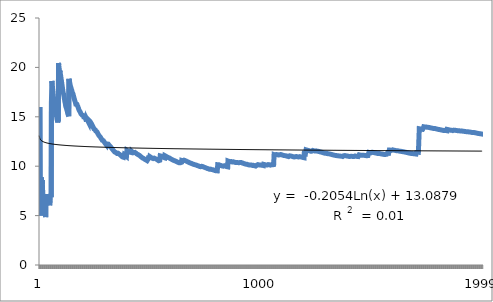
| Category | Series 0 |
|---|---|
| 0 | 16 |
| 1 | 9 |
| 2 | 7.333 |
| 3 | 6 |
| 4 | 5.6 |
| 5 | 5 |
| 6 | 8.857 |
| 7 | 8.25 |
| 8 | 7.778 |
| 9 | 8.6 |
| 10 | 8.182 |
| 11 | 7.667 |
| 12 | 7.385 |
| 13 | 7 |
| 14 | 6.667 |
| 15 | 6.5 |
| 16 | 6.353 |
| 17 | 6.111 |
| 18 | 5.895 |
| 19 | 5.7 |
| 20 | 5.524 |
| 21 | 5.364 |
| 22 | 5.217 |
| 23 | 5.083 |
| 24 | 4.96 |
| 25 | 4.846 |
| 26 | 7.037 |
| 27 | 6.857 |
| 28 | 7.172 |
| 29 | 7 |
| 30 | 6.839 |
| 31 | 6.75 |
| 32 | 6.788 |
| 33 | 6.706 |
| 34 | 6.571 |
| 35 | 6.5 |
| 36 | 6.378 |
| 37 | 6.263 |
| 38 | 6.154 |
| 39 | 6.4 |
| 40 | 6.293 |
| 41 | 6.19 |
| 42 | 6.14 |
| 43 | 6.045 |
| 44 | 6 |
| 45 | 6.565 |
| 46 | 6.596 |
| 47 | 7.125 |
| 48 | 7.02 |
| 49 | 6.96 |
| 50 | 6.863 |
| 51 | 16.577 |
| 52 | 16.566 |
| 53 | 18.63 |
| 54 | 18.436 |
| 55 | 18.179 |
| 56 | 17.895 |
| 57 | 17.724 |
| 58 | 17.492 |
| 59 | 17.233 |
| 60 | 16.984 |
| 61 | 16.742 |
| 62 | 16.508 |
| 63 | 16.281 |
| 64 | 16.062 |
| 65 | 15.939 |
| 66 | 15.821 |
| 67 | 15.706 |
| 68 | 15.536 |
| 69 | 15.371 |
| 70 | 15.606 |
| 71 | 15.5 |
| 72 | 15.342 |
| 73 | 15.162 |
| 74 | 15.067 |
| 75 | 14.921 |
| 76 | 14.753 |
| 77 | 14.667 |
| 78 | 14.582 |
| 79 | 14.425 |
| 80 | 14.642 |
| 81 | 14.659 |
| 82 | 14.53 |
| 83 | 20.452 |
| 84 | 20.235 |
| 85 | 20.023 |
| 86 | 19.885 |
| 87 | 19.705 |
| 88 | 19.528 |
| 89 | 19.667 |
| 90 | 19.473 |
| 91 | 19.435 |
| 92 | 19.269 |
| 93 | 19.106 |
| 94 | 18.947 |
| 95 | 18.771 |
| 96 | 18.66 |
| 97 | 18.49 |
| 98 | 18.343 |
| 99 | 18.18 |
| 100 | 18.02 |
| 101 | 17.863 |
| 102 | 17.709 |
| 103 | 17.558 |
| 104 | 17.429 |
| 105 | 17.415 |
| 106 | 17.29 |
| 107 | 17.148 |
| 108 | 17.028 |
| 109 | 16.891 |
| 110 | 16.757 |
| 111 | 16.625 |
| 112 | 16.496 |
| 113 | 16.386 |
| 114 | 16.261 |
| 115 | 16.138 |
| 116 | 16.017 |
| 117 | 15.949 |
| 118 | 15.95 |
| 119 | 15.85 |
| 120 | 15.736 |
| 121 | 15.672 |
| 122 | 15.61 |
| 123 | 15.5 |
| 124 | 15.392 |
| 125 | 15.333 |
| 126 | 15.228 |
| 127 | 15.234 |
| 128 | 15.132 |
| 129 | 15.046 |
| 130 | 18.84 |
| 131 | 18.758 |
| 132 | 18.632 |
| 133 | 18.507 |
| 134 | 18.385 |
| 135 | 18.265 |
| 136 | 18.146 |
| 137 | 18.072 |
| 138 | 18.058 |
| 139 | 17.943 |
| 140 | 17.83 |
| 141 | 17.817 |
| 142 | 17.72 |
| 143 | 17.653 |
| 144 | 17.545 |
| 145 | 17.438 |
| 146 | 17.537 |
| 147 | 17.432 |
| 148 | 17.329 |
| 149 | 17.227 |
| 150 | 17.166 |
| 151 | 17.079 |
| 152 | 16.98 |
| 153 | 16.883 |
| 154 | 16.826 |
| 155 | 16.731 |
| 156 | 16.637 |
| 157 | 16.582 |
| 158 | 16.503 |
| 159 | 16.45 |
| 160 | 16.36 |
| 161 | 16.272 |
| 162 | 16.184 |
| 163 | 16.28 |
| 164 | 16.206 |
| 165 | 16.301 |
| 166 | 16.251 |
| 167 | 16.202 |
| 168 | 16.13 |
| 169 | 16.129 |
| 170 | 16.058 |
| 171 | 15.977 |
| 172 | 15.931 |
| 173 | 15.851 |
| 174 | 15.783 |
| 175 | 15.705 |
| 176 | 15.661 |
| 177 | 15.663 |
| 178 | 15.62 |
| 179 | 15.544 |
| 180 | 15.503 |
| 181 | 15.505 |
| 182 | 15.432 |
| 183 | 15.37 |
| 184 | 15.308 |
| 185 | 15.398 |
| 186 | 15.358 |
| 187 | 15.287 |
| 188 | 15.217 |
| 189 | 15.179 |
| 190 | 15.267 |
| 191 | 15.271 |
| 192 | 15.202 |
| 193 | 15.206 |
| 194 | 15.138 |
| 195 | 15.071 |
| 196 | 15.015 |
| 197 | 14.98 |
| 198 | 15.065 |
| 199 | 15 |
| 200 | 15.085 |
| 201 | 15.02 |
| 202 | 14.956 |
| 203 | 14.902 |
| 204 | 14.839 |
| 205 | 14.777 |
| 206 | 14.715 |
| 207 | 14.663 |
| 208 | 14.603 |
| 209 | 14.552 |
| 210 | 14.787 |
| 211 | 14.736 |
| 212 | 14.704 |
| 213 | 14.654 |
| 214 | 14.595 |
| 215 | 14.602 |
| 216 | 14.544 |
| 217 | 14.495 |
| 218 | 14.466 |
| 219 | 14.409 |
| 220 | 14.633 |
| 221 | 14.577 |
| 222 | 14.655 |
| 223 | 14.598 |
| 224 | 14.569 |
| 225 | 14.522 |
| 226 | 14.467 |
| 227 | 14.474 |
| 228 | 14.419 |
| 229 | 14.391 |
| 230 | 14.338 |
| 231 | 14.31 |
| 232 | 14.283 |
| 233 | 14.231 |
| 234 | 14.179 |
| 235 | 14.127 |
| 236 | 14.084 |
| 237 | 14.042 |
| 238 | 13.992 |
| 239 | 13.942 |
| 240 | 13.9 |
| 241 | 13.851 |
| 242 | 13.811 |
| 243 | 13.762 |
| 244 | 13.722 |
| 245 | 13.797 |
| 246 | 13.749 |
| 247 | 13.71 |
| 248 | 13.687 |
| 249 | 13.64 |
| 250 | 13.602 |
| 251 | 13.556 |
| 252 | 13.51 |
| 253 | 13.583 |
| 254 | 13.545 |
| 255 | 13.523 |
| 256 | 13.479 |
| 257 | 13.442 |
| 258 | 13.398 |
| 259 | 13.354 |
| 260 | 13.31 |
| 261 | 13.267 |
| 262 | 13.224 |
| 263 | 13.182 |
| 264 | 13.147 |
| 265 | 13.105 |
| 266 | 13.071 |
| 267 | 13.082 |
| 268 | 13.041 |
| 269 | 13.022 |
| 270 | 12.989 |
| 271 | 12.956 |
| 272 | 12.916 |
| 273 | 12.876 |
| 274 | 12.836 |
| 275 | 12.819 |
| 276 | 12.78 |
| 277 | 12.741 |
| 278 | 12.703 |
| 279 | 12.664 |
| 280 | 12.626 |
| 281 | 12.695 |
| 282 | 12.664 |
| 283 | 12.648 |
| 284 | 12.611 |
| 285 | 12.58 |
| 286 | 12.544 |
| 287 | 12.507 |
| 288 | 12.478 |
| 289 | 12.448 |
| 290 | 12.412 |
| 291 | 12.384 |
| 292 | 12.348 |
| 293 | 12.313 |
| 294 | 12.278 |
| 295 | 12.264 |
| 296 | 12.229 |
| 297 | 12.215 |
| 298 | 12.181 |
| 299 | 12.147 |
| 300 | 12.113 |
| 301 | 12.079 |
| 302 | 12.251 |
| 303 | 12.224 |
| 304 | 12.19 |
| 305 | 12.203 |
| 306 | 12.267 |
| 307 | 12.234 |
| 308 | 12.201 |
| 309 | 12.174 |
| 310 | 12.148 |
| 311 | 12.115 |
| 312 | 12.083 |
| 313 | 12.096 |
| 314 | 12.07 |
| 315 | 12.038 |
| 316 | 12.013 |
| 317 | 11.981 |
| 318 | 11.95 |
| 319 | 11.919 |
| 320 | 11.888 |
| 321 | 11.857 |
| 322 | 11.827 |
| 323 | 11.796 |
| 324 | 11.772 |
| 325 | 11.742 |
| 326 | 11.713 |
| 327 | 11.683 |
| 328 | 11.653 |
| 329 | 11.624 |
| 330 | 11.601 |
| 331 | 11.572 |
| 332 | 11.55 |
| 333 | 11.521 |
| 334 | 11.493 |
| 335 | 11.464 |
| 336 | 11.436 |
| 337 | 11.408 |
| 338 | 11.469 |
| 339 | 11.441 |
| 340 | 11.419 |
| 341 | 11.392 |
| 342 | 11.405 |
| 343 | 11.378 |
| 344 | 11.351 |
| 345 | 11.324 |
| 346 | 11.297 |
| 347 | 11.31 |
| 348 | 11.289 |
| 349 | 11.263 |
| 350 | 11.254 |
| 351 | 11.312 |
| 352 | 11.286 |
| 353 | 11.26 |
| 354 | 11.234 |
| 355 | 11.247 |
| 356 | 11.227 |
| 357 | 11.207 |
| 358 | 11.198 |
| 359 | 11.189 |
| 360 | 11.169 |
| 361 | 11.144 |
| 362 | 11.118 |
| 363 | 11.099 |
| 364 | 11.074 |
| 365 | 11.049 |
| 366 | 11.03 |
| 367 | 11.011 |
| 368 | 10.986 |
| 369 | 10.968 |
| 370 | 10.96 |
| 371 | 10.941 |
| 372 | 10.917 |
| 373 | 10.893 |
| 374 | 10.907 |
| 375 | 10.92 |
| 376 | 10.902 |
| 377 | 10.878 |
| 378 | 10.86 |
| 379 | 11.168 |
| 380 | 11.181 |
| 381 | 11.157 |
| 382 | 11.133 |
| 383 | 11.109 |
| 384 | 11.086 |
| 385 | 11.062 |
| 386 | 11.054 |
| 387 | 11.036 |
| 388 | 11.013 |
| 389 | 10.995 |
| 390 | 10.977 |
| 391 | 11.602 |
| 392 | 11.593 |
| 393 | 11.574 |
| 394 | 11.554 |
| 395 | 11.545 |
| 396 | 11.526 |
| 397 | 11.578 |
| 398 | 11.554 |
| 399 | 11.53 |
| 400 | 11.506 |
| 401 | 11.498 |
| 402 | 11.489 |
| 403 | 11.465 |
| 404 | 11.457 |
| 405 | 11.433 |
| 406 | 11.41 |
| 407 | 11.387 |
| 408 | 11.364 |
| 409 | 11.356 |
| 410 | 11.406 |
| 411 | 11.383 |
| 412 | 11.511 |
| 413 | 11.488 |
| 414 | 11.465 |
| 415 | 11.447 |
| 416 | 11.424 |
| 417 | 11.407 |
| 418 | 11.389 |
| 419 | 11.367 |
| 420 | 11.344 |
| 421 | 11.393 |
| 422 | 11.385 |
| 423 | 11.396 |
| 424 | 11.445 |
| 425 | 11.423 |
| 426 | 11.405 |
| 427 | 11.397 |
| 428 | 11.38 |
| 429 | 11.363 |
| 430 | 11.346 |
| 431 | 11.338 |
| 432 | 11.316 |
| 433 | 11.3 |
| 434 | 11.283 |
| 435 | 11.266 |
| 436 | 11.245 |
| 437 | 11.224 |
| 438 | 11.203 |
| 439 | 11.195 |
| 440 | 11.206 |
| 441 | 11.186 |
| 442 | 11.169 |
| 443 | 11.149 |
| 444 | 11.16 |
| 445 | 11.139 |
| 446 | 11.119 |
| 447 | 11.098 |
| 448 | 11.078 |
| 449 | 11.062 |
| 450 | 11.042 |
| 451 | 11.022 |
| 452 | 11.002 |
| 453 | 10.982 |
| 454 | 10.967 |
| 455 | 10.947 |
| 456 | 10.928 |
| 457 | 10.908 |
| 458 | 10.902 |
| 459 | 10.883 |
| 460 | 10.863 |
| 461 | 10.844 |
| 462 | 10.825 |
| 463 | 10.806 |
| 464 | 10.791 |
| 465 | 10.803 |
| 466 | 10.784 |
| 467 | 10.769 |
| 468 | 10.755 |
| 469 | 10.736 |
| 470 | 10.718 |
| 471 | 10.712 |
| 472 | 10.693 |
| 473 | 10.688 |
| 474 | 10.669 |
| 475 | 10.651 |
| 476 | 10.637 |
| 477 | 10.632 |
| 478 | 10.614 |
| 479 | 10.596 |
| 480 | 10.582 |
| 481 | 10.568 |
| 482 | 10.563 |
| 483 | 10.545 |
| 484 | 10.54 |
| 485 | 10.523 |
| 486 | 10.505 |
| 487 | 10.746 |
| 488 | 10.855 |
| 489 | 10.865 |
| 490 | 10.851 |
| 491 | 10.894 |
| 492 | 10.88 |
| 493 | 10.862 |
| 494 | 10.97 |
| 495 | 10.952 |
| 496 | 10.946 |
| 497 | 10.928 |
| 498 | 10.914 |
| 499 | 10.896 |
| 500 | 10.882 |
| 501 | 10.865 |
| 502 | 10.847 |
| 503 | 10.829 |
| 504 | 10.824 |
| 505 | 10.806 |
| 506 | 10.793 |
| 507 | 10.803 |
| 508 | 10.79 |
| 509 | 10.773 |
| 510 | 10.759 |
| 511 | 10.801 |
| 512 | 10.811 |
| 513 | 10.805 |
| 514 | 10.816 |
| 515 | 10.826 |
| 516 | 10.809 |
| 517 | 10.792 |
| 518 | 10.778 |
| 519 | 10.762 |
| 520 | 10.745 |
| 521 | 10.739 |
| 522 | 10.727 |
| 523 | 10.721 |
| 524 | 10.705 |
| 525 | 10.688 |
| 526 | 10.672 |
| 527 | 10.667 |
| 528 | 10.65 |
| 529 | 10.634 |
| 530 | 10.621 |
| 531 | 10.605 |
| 532 | 10.589 |
| 533 | 10.573 |
| 534 | 10.557 |
| 535 | 10.541 |
| 536 | 10.525 |
| 537 | 10.513 |
| 538 | 10.612 |
| 539 | 10.596 |
| 540 | 10.591 |
| 541 | 11.044 |
| 542 | 11.053 |
| 543 | 11.048 |
| 544 | 11.035 |
| 545 | 11.029 |
| 546 | 11.016 |
| 547 | 11 |
| 548 | 10.984 |
| 549 | 10.967 |
| 550 | 10.962 |
| 551 | 10.971 |
| 552 | 10.955 |
| 553 | 10.939 |
| 554 | 10.923 |
| 555 | 10.91 |
| 556 | 10.894 |
| 557 | 10.878 |
| 558 | 10.862 |
| 559 | 10.871 |
| 560 | 10.859 |
| 561 | 10.854 |
| 562 | 11.062 |
| 563 | 11.046 |
| 564 | 11.034 |
| 565 | 11.018 |
| 566 | 11.012 |
| 567 | 11 |
| 568 | 10.984 |
| 569 | 10.979 |
| 570 | 10.963 |
| 571 | 10.951 |
| 572 | 10.935 |
| 573 | 10.923 |
| 574 | 10.918 |
| 575 | 10.906 |
| 576 | 10.894 |
| 577 | 10.879 |
| 578 | 10.867 |
| 579 | 10.862 |
| 580 | 10.857 |
| 581 | 10.845 |
| 582 | 10.83 |
| 583 | 10.825 |
| 584 | 10.81 |
| 585 | 10.795 |
| 586 | 10.78 |
| 587 | 10.765 |
| 588 | 10.754 |
| 589 | 10.739 |
| 590 | 10.724 |
| 591 | 10.713 |
| 592 | 10.698 |
| 593 | 10.687 |
| 594 | 10.672 |
| 595 | 10.658 |
| 596 | 10.653 |
| 597 | 10.639 |
| 598 | 10.624 |
| 599 | 10.62 |
| 600 | 10.606 |
| 601 | 10.591 |
| 602 | 10.587 |
| 603 | 10.583 |
| 604 | 10.579 |
| 605 | 10.564 |
| 606 | 10.55 |
| 607 | 10.539 |
| 608 | 10.529 |
| 609 | 10.525 |
| 610 | 10.514 |
| 611 | 10.5 |
| 612 | 10.496 |
| 613 | 10.485 |
| 614 | 10.472 |
| 615 | 10.458 |
| 616 | 10.444 |
| 617 | 10.434 |
| 618 | 10.42 |
| 619 | 10.406 |
| 620 | 10.393 |
| 621 | 10.379 |
| 622 | 10.388 |
| 623 | 10.375 |
| 624 | 10.365 |
| 625 | 10.355 |
| 626 | 10.344 |
| 627 | 10.341 |
| 628 | 10.331 |
| 629 | 10.365 |
| 630 | 10.355 |
| 631 | 10.342 |
| 632 | 10.351 |
| 633 | 10.435 |
| 634 | 10.431 |
| 635 | 10.418 |
| 636 | 10.405 |
| 637 | 10.395 |
| 638 | 10.579 |
| 639 | 10.575 |
| 640 | 10.565 |
| 641 | 10.551 |
| 642 | 10.56 |
| 643 | 10.547 |
| 644 | 10.555 |
| 645 | 10.542 |
| 646 | 10.624 |
| 647 | 10.62 |
| 648 | 10.61 |
| 649 | 10.606 |
| 650 | 10.596 |
| 651 | 10.586 |
| 652 | 10.582 |
| 653 | 10.569 |
| 654 | 10.565 |
| 655 | 10.552 |
| 656 | 10.539 |
| 657 | 10.529 |
| 658 | 10.519 |
| 659 | 10.506 |
| 660 | 10.496 |
| 661 | 10.486 |
| 662 | 10.474 |
| 663 | 10.461 |
| 664 | 10.448 |
| 665 | 10.435 |
| 666 | 10.432 |
| 667 | 10.422 |
| 668 | 10.41 |
| 669 | 10.397 |
| 670 | 10.387 |
| 671 | 10.378 |
| 672 | 10.366 |
| 673 | 10.353 |
| 674 | 10.344 |
| 675 | 10.331 |
| 676 | 10.319 |
| 677 | 10.316 |
| 678 | 10.306 |
| 679 | 10.297 |
| 680 | 10.285 |
| 681 | 10.293 |
| 682 | 10.281 |
| 683 | 10.269 |
| 684 | 10.257 |
| 685 | 10.254 |
| 686 | 10.242 |
| 687 | 10.23 |
| 688 | 10.218 |
| 689 | 10.206 |
| 690 | 10.194 |
| 691 | 10.191 |
| 692 | 10.179 |
| 693 | 10.176 |
| 694 | 10.173 |
| 695 | 10.161 |
| 696 | 10.149 |
| 697 | 10.138 |
| 698 | 10.146 |
| 699 | 10.134 |
| 700 | 10.126 |
| 701 | 10.117 |
| 702 | 10.125 |
| 703 | 10.116 |
| 704 | 10.105 |
| 705 | 10.093 |
| 706 | 10.085 |
| 707 | 10.076 |
| 708 | 10.065 |
| 709 | 10.054 |
| 710 | 10.062 |
| 711 | 10.053 |
| 712 | 10.042 |
| 713 | 10.031 |
| 714 | 10.022 |
| 715 | 10.011 |
| 716 | 10 |
| 717 | 9.992 |
| 718 | 9.981 |
| 719 | 9.972 |
| 720 | 9.961 |
| 721 | 9.95 |
| 722 | 9.939 |
| 723 | 9.948 |
| 724 | 9.937 |
| 725 | 9.926 |
| 726 | 10 |
| 727 | 9.997 |
| 728 | 9.989 |
| 729 | 9.981 |
| 730 | 9.978 |
| 731 | 9.97 |
| 732 | 9.962 |
| 733 | 9.959 |
| 734 | 9.948 |
| 735 | 9.938 |
| 736 | 9.927 |
| 737 | 9.919 |
| 738 | 9.908 |
| 739 | 9.9 |
| 740 | 9.892 |
| 741 | 9.881 |
| 742 | 9.873 |
| 743 | 9.863 |
| 744 | 9.855 |
| 745 | 9.847 |
| 746 | 9.839 |
| 747 | 9.832 |
| 748 | 9.821 |
| 749 | 9.811 |
| 750 | 9.8 |
| 751 | 9.79 |
| 752 | 9.78 |
| 753 | 9.769 |
| 754 | 9.759 |
| 755 | 9.767 |
| 756 | 9.757 |
| 757 | 9.747 |
| 758 | 9.736 |
| 759 | 9.734 |
| 760 | 9.724 |
| 761 | 9.714 |
| 762 | 9.704 |
| 763 | 9.694 |
| 764 | 9.702 |
| 765 | 9.692 |
| 766 | 9.721 |
| 767 | 9.711 |
| 768 | 9.704 |
| 769 | 9.696 |
| 770 | 9.686 |
| 771 | 9.676 |
| 772 | 9.666 |
| 773 | 9.656 |
| 774 | 9.685 |
| 775 | 9.678 |
| 776 | 9.668 |
| 777 | 9.658 |
| 778 | 9.648 |
| 779 | 9.638 |
| 780 | 9.631 |
| 781 | 9.621 |
| 782 | 9.612 |
| 783 | 9.602 |
| 784 | 9.592 |
| 785 | 9.583 |
| 786 | 9.573 |
| 787 | 9.563 |
| 788 | 9.554 |
| 789 | 9.544 |
| 790 | 9.542 |
| 791 | 9.54 |
| 792 | 9.538 |
| 793 | 9.537 |
| 794 | 9.527 |
| 795 | 9.555 |
| 796 | 9.548 |
| 797 | 9.539 |
| 798 | 9.529 |
| 799 | 9.528 |
| 800 | 10.155 |
| 801 | 10.147 |
| 802 | 10.139 |
| 803 | 10.129 |
| 804 | 10.157 |
| 805 | 10.149 |
| 806 | 10.139 |
| 807 | 10.131 |
| 808 | 10.121 |
| 809 | 10.111 |
| 810 | 10.101 |
| 811 | 10.094 |
| 812 | 10.084 |
| 813 | 10.076 |
| 814 | 10.074 |
| 815 | 10.066 |
| 816 | 10.056 |
| 817 | 10.046 |
| 818 | 10.039 |
| 819 | 10.029 |
| 820 | 10.022 |
| 821 | 10.012 |
| 822 | 10.019 |
| 823 | 10.01 |
| 824 | 10.007 |
| 825 | 10 |
| 826 | 10.065 |
| 827 | 10.072 |
| 828 | 10.063 |
| 829 | 10.053 |
| 830 | 10.046 |
| 831 | 10.036 |
| 832 | 10.026 |
| 833 | 10.017 |
| 834 | 10.014 |
| 835 | 10.005 |
| 836 | 9.995 |
| 837 | 9.988 |
| 838 | 9.979 |
| 839 | 9.969 |
| 840 | 9.96 |
| 841 | 9.952 |
| 842 | 9.943 |
| 843 | 9.936 |
| 844 | 9.929 |
| 845 | 9.936 |
| 846 | 10.529 |
| 847 | 10.519 |
| 848 | 10.509 |
| 849 | 10.501 |
| 850 | 10.491 |
| 851 | 10.488 |
| 852 | 10.478 |
| 853 | 10.468 |
| 854 | 10.461 |
| 855 | 10.453 |
| 856 | 10.443 |
| 857 | 10.506 |
| 858 | 10.498 |
| 859 | 10.491 |
| 860 | 10.481 |
| 861 | 10.471 |
| 862 | 10.461 |
| 863 | 10.454 |
| 864 | 10.444 |
| 865 | 10.434 |
| 866 | 10.424 |
| 867 | 10.415 |
| 868 | 10.405 |
| 869 | 10.43 |
| 870 | 10.42 |
| 871 | 10.445 |
| 872 | 10.435 |
| 873 | 10.428 |
| 874 | 10.421 |
| 875 | 10.413 |
| 876 | 10.404 |
| 877 | 10.394 |
| 878 | 10.385 |
| 879 | 10.375 |
| 880 | 10.381 |
| 881 | 10.372 |
| 882 | 10.362 |
| 883 | 10.355 |
| 884 | 10.348 |
| 885 | 10.339 |
| 886 | 10.363 |
| 887 | 10.354 |
| 888 | 10.351 |
| 889 | 10.342 |
| 890 | 10.339 |
| 891 | 10.363 |
| 892 | 10.356 |
| 893 | 10.347 |
| 894 | 10.337 |
| 895 | 10.362 |
| 896 | 10.352 |
| 897 | 10.343 |
| 898 | 10.334 |
| 899 | 10.393 |
| 900 | 10.384 |
| 901 | 10.375 |
| 902 | 10.365 |
| 903 | 10.389 |
| 904 | 10.382 |
| 905 | 10.375 |
| 906 | 10.368 |
| 907 | 10.359 |
| 908 | 10.35 |
| 909 | 10.341 |
| 910 | 10.334 |
| 911 | 10.325 |
| 912 | 10.315 |
| 913 | 10.309 |
| 914 | 10.302 |
| 915 | 10.295 |
| 916 | 10.286 |
| 917 | 10.279 |
| 918 | 10.27 |
| 919 | 10.263 |
| 920 | 10.254 |
| 921 | 10.247 |
| 922 | 10.241 |
| 923 | 10.234 |
| 924 | 10.225 |
| 925 | 10.218 |
| 926 | 10.209 |
| 927 | 10.203 |
| 928 | 10.194 |
| 929 | 10.185 |
| 930 | 10.176 |
| 931 | 10.2 |
| 932 | 10.193 |
| 933 | 10.184 |
| 934 | 10.175 |
| 935 | 10.169 |
| 936 | 10.16 |
| 937 | 10.154 |
| 938 | 10.145 |
| 939 | 10.136 |
| 940 | 10.13 |
| 941 | 10.127 |
| 942 | 10.121 |
| 943 | 10.114 |
| 944 | 10.121 |
| 945 | 10.112 |
| 946 | 10.118 |
| 947 | 10.116 |
| 948 | 10.11 |
| 949 | 10.101 |
| 950 | 10.099 |
| 951 | 10.122 |
| 952 | 10.113 |
| 953 | 10.105 |
| 954 | 10.098 |
| 955 | 10.09 |
| 956 | 10.082 |
| 957 | 10.079 |
| 958 | 10.102 |
| 959 | 10.096 |
| 960 | 10.094 |
| 961 | 10.085 |
| 962 | 10.079 |
| 963 | 10.071 |
| 964 | 10.062 |
| 965 | 10.056 |
| 966 | 10.048 |
| 967 | 10.041 |
| 968 | 10.033 |
| 969 | 10.031 |
| 970 | 10.023 |
| 971 | 10.014 |
| 972 | 10.006 |
| 973 | 9.998 |
| 974 | 9.992 |
| 975 | 10.113 |
| 976 | 10.106 |
| 977 | 10.098 |
| 978 | 10.09 |
| 979 | 10.145 |
| 980 | 10.167 |
| 981 | 10.159 |
| 982 | 10.157 |
| 983 | 10.15 |
| 984 | 10.142 |
| 985 | 10.134 |
| 986 | 10.132 |
| 987 | 10.126 |
| 988 | 10.148 |
| 989 | 10.141 |
| 990 | 10.135 |
| 991 | 10.129 |
| 992 | 10.135 |
| 993 | 10.129 |
| 994 | 10.121 |
| 995 | 10.112 |
| 996 | 10.106 |
| 997 | 10.104 |
| 998 | 10.102 |
| 999 | 10.1 |
| 1000 | 10.092 |
| 1001 | 10.098 |
| 1002 | 10.092 |
| 1003 | 10.086 |
| 1004 | 10.08 |
| 1005 | 10.074 |
| 1006 | 10.068 |
| 1007 | 10.185 |
| 1008 | 10.176 |
| 1009 | 10.182 |
| 1010 | 10.174 |
| 1011 | 10.166 |
| 1012 | 10.158 |
| 1013 | 10.152 |
| 1014 | 10.144 |
| 1015 | 10.136 |
| 1016 | 10.134 |
| 1017 | 10.126 |
| 1018 | 10.147 |
| 1019 | 10.139 |
| 1020 | 10.131 |
| 1021 | 10.123 |
| 1022 | 10.115 |
| 1023 | 10.121 |
| 1024 | 10.113 |
| 1025 | 10.105 |
| 1026 | 10.158 |
| 1027 | 10.163 |
| 1028 | 10.155 |
| 1029 | 10.148 |
| 1030 | 10.145 |
| 1031 | 10.14 |
| 1032 | 10.145 |
| 1033 | 10.137 |
| 1034 | 10.129 |
| 1035 | 10.124 |
| 1036 | 10.116 |
| 1037 | 10.108 |
| 1038 | 10.1 |
| 1039 | 10.094 |
| 1040 | 10.1 |
| 1041 | 10.106 |
| 1042 | 10.157 |
| 1043 | 10.163 |
| 1044 | 10.157 |
| 1045 | 10.149 |
| 1046 | 10.143 |
| 1047 | 10.141 |
| 1048 | 10.135 |
| 1049 | 10.128 |
| 1050 | 10.12 |
| 1051 | 10.171 |
| 1052 | 10.163 |
| 1053 | 10.214 |
| 1054 | 11.175 |
| 1055 | 11.167 |
| 1056 | 11.164 |
| 1057 | 11.155 |
| 1058 | 11.146 |
| 1059 | 11.14 |
| 1060 | 11.131 |
| 1061 | 11.122 |
| 1062 | 11.172 |
| 1063 | 11.177 |
| 1064 | 11.181 |
| 1065 | 11.173 |
| 1066 | 11.17 |
| 1067 | 11.163 |
| 1068 | 11.16 |
| 1069 | 11.164 |
| 1070 | 11.156 |
| 1071 | 11.147 |
| 1072 | 11.139 |
| 1073 | 11.136 |
| 1074 | 11.129 |
| 1075 | 11.123 |
| 1076 | 11.172 |
| 1077 | 11.176 |
| 1078 | 11.17 |
| 1079 | 11.161 |
| 1080 | 11.153 |
| 1081 | 11.201 |
| 1082 | 11.193 |
| 1083 | 11.19 |
| 1084 | 11.182 |
| 1085 | 11.173 |
| 1086 | 11.17 |
| 1087 | 11.162 |
| 1088 | 11.153 |
| 1089 | 11.145 |
| 1090 | 11.137 |
| 1091 | 11.128 |
| 1092 | 11.12 |
| 1093 | 11.113 |
| 1094 | 11.107 |
| 1095 | 11.099 |
| 1096 | 11.09 |
| 1097 | 11.082 |
| 1098 | 11.079 |
| 1099 | 11.071 |
| 1100 | 11.064 |
| 1101 | 11.083 |
| 1102 | 11.075 |
| 1103 | 11.072 |
| 1104 | 11.07 |
| 1105 | 11.074 |
| 1106 | 11.066 |
| 1107 | 11.06 |
| 1108 | 11.051 |
| 1109 | 11.043 |
| 1110 | 11.035 |
| 1111 | 11.027 |
| 1112 | 11.021 |
| 1113 | 11.013 |
| 1114 | 11.006 |
| 1115 | 11.004 |
| 1116 | 10.996 |
| 1117 | 10.987 |
| 1118 | 10.979 |
| 1119 | 10.971 |
| 1120 | 10.969 |
| 1121 | 10.963 |
| 1122 | 10.956 |
| 1123 | 10.948 |
| 1124 | 11.052 |
| 1125 | 11.046 |
| 1126 | 11.051 |
| 1127 | 11.043 |
| 1128 | 11.04 |
| 1129 | 11.034 |
| 1130 | 11.027 |
| 1131 | 11.021 |
| 1132 | 11.013 |
| 1133 | 11.007 |
| 1134 | 11.004 |
| 1135 | 10.996 |
| 1136 | 10.989 |
| 1137 | 10.981 |
| 1138 | 10.973 |
| 1139 | 10.965 |
| 1140 | 10.959 |
| 1141 | 10.953 |
| 1142 | 10.945 |
| 1143 | 10.939 |
| 1144 | 10.936 |
| 1145 | 10.928 |
| 1146 | 10.926 |
| 1147 | 10.918 |
| 1148 | 10.91 |
| 1149 | 10.957 |
| 1150 | 10.949 |
| 1151 | 10.943 |
| 1152 | 10.94 |
| 1153 | 10.986 |
| 1154 | 10.978 |
| 1155 | 10.972 |
| 1156 | 10.97 |
| 1157 | 10.962 |
| 1158 | 10.959 |
| 1159 | 10.952 |
| 1160 | 10.956 |
| 1161 | 10.954 |
| 1162 | 10.946 |
| 1163 | 10.938 |
| 1164 | 10.932 |
| 1165 | 10.925 |
| 1166 | 10.929 |
| 1167 | 10.974 |
| 1168 | 10.972 |
| 1169 | 10.966 |
| 1170 | 10.958 |
| 1171 | 10.952 |
| 1172 | 10.946 |
| 1173 | 10.939 |
| 1174 | 10.943 |
| 1175 | 10.935 |
| 1176 | 10.928 |
| 1177 | 10.932 |
| 1178 | 10.926 |
| 1179 | 10.919 |
| 1180 | 10.911 |
| 1181 | 10.904 |
| 1182 | 10.896 |
| 1183 | 10.89 |
| 1184 | 10.883 |
| 1185 | 10.887 |
| 1186 | 10.881 |
| 1187 | 10.874 |
| 1188 | 10.866 |
| 1189 | 10.859 |
| 1190 | 11.28 |
| 1191 | 11.273 |
| 1192 | 11.266 |
| 1193 | 11.263 |
| 1194 | 11.255 |
| 1195 | 11.249 |
| 1196 | 11.241 |
| 1197 | 11.239 |
| 1198 | 11.656 |
| 1199 | 11.653 |
| 1200 | 11.645 |
| 1201 | 11.639 |
| 1202 | 11.631 |
| 1203 | 11.623 |
| 1204 | 11.615 |
| 1205 | 11.609 |
| 1206 | 11.606 |
| 1207 | 11.599 |
| 1208 | 11.593 |
| 1209 | 11.585 |
| 1210 | 11.577 |
| 1211 | 11.571 |
| 1212 | 11.565 |
| 1213 | 11.557 |
| 1214 | 11.551 |
| 1215 | 11.543 |
| 1216 | 11.537 |
| 1217 | 11.529 |
| 1218 | 11.521 |
| 1219 | 11.513 |
| 1220 | 11.507 |
| 1221 | 11.511 |
| 1222 | 11.503 |
| 1223 | 11.52 |
| 1224 | 11.512 |
| 1225 | 11.515 |
| 1226 | 11.508 |
| 1227 | 11.5 |
| 1228 | 11.595 |
| 1229 | 11.587 |
| 1230 | 11.579 |
| 1231 | 11.571 |
| 1232 | 11.569 |
| 1233 | 11.561 |
| 1234 | 11.558 |
| 1235 | 11.55 |
| 1236 | 11.542 |
| 1237 | 11.546 |
| 1238 | 11.54 |
| 1239 | 11.534 |
| 1240 | 11.576 |
| 1241 | 11.568 |
| 1242 | 11.561 |
| 1243 | 11.553 |
| 1244 | 11.55 |
| 1245 | 11.543 |
| 1246 | 11.535 |
| 1247 | 11.529 |
| 1248 | 11.521 |
| 1249 | 11.515 |
| 1250 | 11.519 |
| 1251 | 11.516 |
| 1252 | 11.508 |
| 1253 | 11.506 |
| 1254 | 11.498 |
| 1255 | 11.495 |
| 1256 | 11.488 |
| 1257 | 11.48 |
| 1258 | 11.473 |
| 1259 | 11.467 |
| 1260 | 11.461 |
| 1261 | 11.455 |
| 1262 | 11.447 |
| 1263 | 11.441 |
| 1264 | 11.439 |
| 1265 | 11.431 |
| 1266 | 11.429 |
| 1267 | 11.421 |
| 1268 | 11.414 |
| 1269 | 11.406 |
| 1270 | 11.4 |
| 1271 | 11.393 |
| 1272 | 11.386 |
| 1273 | 11.378 |
| 1274 | 11.373 |
| 1275 | 11.365 |
| 1276 | 11.358 |
| 1277 | 11.351 |
| 1278 | 11.343 |
| 1279 | 11.338 |
| 1280 | 11.33 |
| 1281 | 11.323 |
| 1282 | 11.317 |
| 1283 | 11.312 |
| 1284 | 11.304 |
| 1285 | 11.299 |
| 1286 | 11.293 |
| 1287 | 11.286 |
| 1288 | 11.302 |
| 1289 | 11.295 |
| 1290 | 11.287 |
| 1291 | 11.282 |
| 1292 | 11.279 |
| 1293 | 11.283 |
| 1294 | 11.277 |
| 1295 | 11.27 |
| 1296 | 11.268 |
| 1297 | 11.26 |
| 1298 | 11.258 |
| 1299 | 11.251 |
| 1300 | 11.254 |
| 1301 | 11.247 |
| 1302 | 11.242 |
| 1303 | 11.245 |
| 1304 | 11.238 |
| 1305 | 11.233 |
| 1306 | 11.227 |
| 1307 | 11.22 |
| 1308 | 11.215 |
| 1309 | 11.212 |
| 1310 | 11.205 |
| 1311 | 11.2 |
| 1312 | 11.193 |
| 1313 | 11.187 |
| 1314 | 11.18 |
| 1315 | 11.175 |
| 1316 | 11.168 |
| 1317 | 11.162 |
| 1318 | 11.155 |
| 1319 | 11.148 |
| 1320 | 11.142 |
| 1321 | 11.135 |
| 1322 | 11.128 |
| 1323 | 11.122 |
| 1324 | 11.115 |
| 1325 | 11.109 |
| 1326 | 11.102 |
| 1327 | 11.105 |
| 1328 | 11.099 |
| 1329 | 11.102 |
| 1330 | 11.106 |
| 1331 | 11.099 |
| 1332 | 11.092 |
| 1333 | 11.085 |
| 1334 | 11.08 |
| 1335 | 11.078 |
| 1336 | 11.073 |
| 1337 | 11.07 |
| 1338 | 11.063 |
| 1339 | 11.057 |
| 1340 | 11.06 |
| 1341 | 11.055 |
| 1342 | 11.053 |
| 1343 | 11.048 |
| 1344 | 11.063 |
| 1345 | 11.056 |
| 1346 | 11.05 |
| 1347 | 11.045 |
| 1348 | 11.038 |
| 1349 | 11.033 |
| 1350 | 11.027 |
| 1351 | 11.022 |
| 1352 | 11.016 |
| 1353 | 11.019 |
| 1354 | 11.023 |
| 1355 | 11.018 |
| 1356 | 11.013 |
| 1357 | 11.01 |
| 1358 | 11.014 |
| 1359 | 11.007 |
| 1360 | 11.001 |
| 1361 | 10.994 |
| 1362 | 10.988 |
| 1363 | 10.981 |
| 1364 | 10.974 |
| 1365 | 10.972 |
| 1366 | 11.058 |
| 1367 | 11.061 |
| 1368 | 11.065 |
| 1369 | 11.058 |
| 1370 | 11.052 |
| 1371 | 11.045 |
| 1372 | 11.039 |
| 1373 | 11.077 |
| 1374 | 11.071 |
| 1375 | 11.064 |
| 1376 | 11.057 |
| 1377 | 11.052 |
| 1378 | 11.046 |
| 1379 | 11.043 |
| 1380 | 11.037 |
| 1381 | 11.041 |
| 1382 | 11.038 |
| 1383 | 11.036 |
| 1384 | 11.031 |
| 1385 | 11.029 |
| 1386 | 11.022 |
| 1387 | 11.017 |
| 1388 | 11.011 |
| 1389 | 11.004 |
| 1390 | 10.998 |
| 1391 | 10.993 |
| 1392 | 10.986 |
| 1393 | 10.981 |
| 1394 | 10.975 |
| 1395 | 11.013 |
| 1396 | 11.008 |
| 1397 | 11.001 |
| 1398 | 10.995 |
| 1399 | 10.989 |
| 1400 | 10.984 |
| 1401 | 10.981 |
| 1402 | 11.019 |
| 1403 | 11.013 |
| 1404 | 11.008 |
| 1405 | 11.003 |
| 1406 | 10.996 |
| 1407 | 10.99 |
| 1408 | 10.984 |
| 1409 | 10.977 |
| 1410 | 10.971 |
| 1411 | 10.965 |
| 1412 | 10.96 |
| 1413 | 10.975 |
| 1414 | 10.97 |
| 1415 | 10.963 |
| 1416 | 11.046 |
| 1417 | 11.039 |
| 1418 | 11.033 |
| 1419 | 11.027 |
| 1420 | 11.02 |
| 1421 | 11.018 |
| 1422 | 11.012 |
| 1423 | 11.015 |
| 1424 | 11.009 |
| 1425 | 11.003 |
| 1426 | 11.001 |
| 1427 | 10.994 |
| 1428 | 10.988 |
| 1429 | 10.992 |
| 1430 | 10.987 |
| 1431 | 10.985 |
| 1432 | 10.978 |
| 1433 | 10.976 |
| 1434 | 11.058 |
| 1435 | 11.072 |
| 1436 | 11.066 |
| 1437 | 11.147 |
| 1438 | 11.141 |
| 1439 | 11.135 |
| 1440 | 11.128 |
| 1441 | 11.122 |
| 1442 | 11.12 |
| 1443 | 11.134 |
| 1444 | 11.129 |
| 1445 | 11.123 |
| 1446 | 11.117 |
| 1447 | 11.115 |
| 1448 | 11.108 |
| 1449 | 11.112 |
| 1450 | 11.126 |
| 1451 | 11.12 |
| 1452 | 11.118 |
| 1453 | 11.132 |
| 1454 | 11.126 |
| 1455 | 11.12 |
| 1456 | 11.113 |
| 1457 | 11.108 |
| 1458 | 11.102 |
| 1459 | 11.096 |
| 1460 | 11.099 |
| 1461 | 11.097 |
| 1462 | 11.091 |
| 1463 | 11.094 |
| 1464 | 11.089 |
| 1465 | 11.083 |
| 1466 | 11.077 |
| 1467 | 11.071 |
| 1468 | 11.085 |
| 1469 | 11.079 |
| 1470 | 11.073 |
| 1471 | 11.067 |
| 1472 | 11.06 |
| 1473 | 11.056 |
| 1474 | 11.051 |
| 1475 | 11.045 |
| 1476 | 11.039 |
| 1477 | 11.074 |
| 1478 | 11.068 |
| 1479 | 11.066 |
| 1480 | 11.06 |
| 1481 | 11.398 |
| 1482 | 11.392 |
| 1483 | 11.395 |
| 1484 | 11.389 |
| 1485 | 11.382 |
| 1486 | 11.376 |
| 1487 | 11.371 |
| 1488 | 11.369 |
| 1489 | 11.362 |
| 1490 | 11.357 |
| 1491 | 11.355 |
| 1492 | 11.35 |
| 1493 | 11.345 |
| 1494 | 11.339 |
| 1495 | 11.417 |
| 1496 | 11.412 |
| 1497 | 11.407 |
| 1498 | 11.405 |
| 1499 | 11.4 |
| 1500 | 11.394 |
| 1501 | 11.391 |
| 1502 | 11.387 |
| 1503 | 11.38 |
| 1504 | 11.374 |
| 1505 | 11.368 |
| 1506 | 11.362 |
| 1507 | 11.359 |
| 1508 | 11.353 |
| 1509 | 11.347 |
| 1510 | 11.341 |
| 1511 | 11.339 |
| 1512 | 11.336 |
| 1513 | 11.33 |
| 1514 | 11.324 |
| 1515 | 11.318 |
| 1516 | 11.312 |
| 1517 | 11.31 |
| 1518 | 11.305 |
| 1519 | 11.299 |
| 1520 | 11.293 |
| 1521 | 11.286 |
| 1522 | 11.29 |
| 1523 | 11.303 |
| 1524 | 11.298 |
| 1525 | 11.294 |
| 1526 | 11.289 |
| 1527 | 11.287 |
| 1528 | 11.282 |
| 1529 | 11.277 |
| 1530 | 11.28 |
| 1531 | 11.275 |
| 1532 | 11.269 |
| 1533 | 11.263 |
| 1534 | 11.257 |
| 1535 | 11.251 |
| 1536 | 11.245 |
| 1537 | 11.239 |
| 1538 | 11.233 |
| 1539 | 11.229 |
| 1540 | 11.232 |
| 1541 | 11.226 |
| 1542 | 11.22 |
| 1543 | 11.215 |
| 1544 | 11.21 |
| 1545 | 11.208 |
| 1546 | 11.206 |
| 1547 | 11.2 |
| 1548 | 11.196 |
| 1549 | 11.191 |
| 1550 | 11.185 |
| 1551 | 11.18 |
| 1552 | 11.175 |
| 1553 | 11.208 |
| 1554 | 11.203 |
| 1555 | 11.197 |
| 1556 | 11.192 |
| 1557 | 11.226 |
| 1558 | 11.22 |
| 1559 | 11.214 |
| 1560 | 11.217 |
| 1561 | 11.213 |
| 1562 | 11.207 |
| 1563 | 11.201 |
| 1564 | 11.195 |
| 1565 | 11.351 |
| 1566 | 11.345 |
| 1567 | 11.339 |
| 1568 | 11.335 |
| 1569 | 11.33 |
| 1570 | 11.325 |
| 1571 | 11.321 |
| 1572 | 11.318 |
| 1573 | 11.637 |
| 1574 | 11.63 |
| 1575 | 11.624 |
| 1576 | 11.627 |
| 1577 | 11.63 |
| 1578 | 11.628 |
| 1579 | 11.622 |
| 1580 | 11.615 |
| 1581 | 11.618 |
| 1582 | 11.612 |
| 1583 | 11.606 |
| 1584 | 11.639 |
| 1585 | 11.633 |
| 1586 | 11.666 |
| 1587 | 11.661 |
| 1588 | 11.655 |
| 1589 | 11.65 |
| 1590 | 11.644 |
| 1591 | 11.638 |
| 1592 | 11.633 |
| 1593 | 11.627 |
| 1594 | 11.623 |
| 1595 | 11.617 |
| 1596 | 11.614 |
| 1597 | 11.608 |
| 1598 | 11.604 |
| 1599 | 11.598 |
| 1600 | 11.593 |
| 1601 | 11.588 |
| 1602 | 11.583 |
| 1603 | 11.579 |
| 1604 | 11.573 |
| 1605 | 11.567 |
| 1606 | 11.562 |
| 1607 | 11.556 |
| 1608 | 11.551 |
| 1609 | 11.549 |
| 1610 | 11.543 |
| 1611 | 11.541 |
| 1612 | 11.554 |
| 1613 | 11.551 |
| 1614 | 11.547 |
| 1615 | 11.541 |
| 1616 | 11.536 |
| 1617 | 11.53 |
| 1618 | 11.526 |
| 1619 | 11.538 |
| 1620 | 11.534 |
| 1621 | 11.528 |
| 1622 | 11.523 |
| 1623 | 11.518 |
| 1624 | 11.513 |
| 1625 | 11.507 |
| 1626 | 11.501 |
| 1627 | 11.496 |
| 1628 | 11.492 |
| 1629 | 11.494 |
| 1630 | 11.49 |
| 1631 | 11.484 |
| 1632 | 11.479 |
| 1633 | 11.474 |
| 1634 | 11.476 |
| 1635 | 11.472 |
| 1636 | 11.466 |
| 1637 | 11.46 |
| 1638 | 11.456 |
| 1639 | 11.45 |
| 1640 | 11.444 |
| 1641 | 11.44 |
| 1642 | 11.434 |
| 1643 | 11.428 |
| 1644 | 11.426 |
| 1645 | 11.422 |
| 1646 | 11.417 |
| 1647 | 11.413 |
| 1648 | 11.407 |
| 1649 | 11.402 |
| 1650 | 11.397 |
| 1651 | 11.391 |
| 1652 | 11.385 |
| 1653 | 11.38 |
| 1654 | 11.374 |
| 1655 | 11.368 |
| 1656 | 11.364 |
| 1657 | 11.358 |
| 1658 | 11.353 |
| 1659 | 11.347 |
| 1660 | 11.341 |
| 1661 | 11.337 |
| 1662 | 11.331 |
| 1663 | 11.326 |
| 1664 | 11.324 |
| 1665 | 11.318 |
| 1666 | 11.313 |
| 1667 | 11.308 |
| 1668 | 11.303 |
| 1669 | 11.298 |
| 1670 | 11.301 |
| 1671 | 11.295 |
| 1672 | 11.293 |
| 1673 | 11.288 |
| 1674 | 11.282 |
| 1675 | 11.295 |
| 1676 | 11.289 |
| 1677 | 11.287 |
| 1678 | 11.282 |
| 1679 | 11.28 |
| 1680 | 11.274 |
| 1681 | 11.27 |
| 1682 | 11.264 |
| 1683 | 11.259 |
| 1684 | 11.255 |
| 1685 | 11.249 |
| 1686 | 11.244 |
| 1687 | 11.238 |
| 1688 | 11.25 |
| 1689 | 11.245 |
| 1690 | 11.241 |
| 1691 | 11.243 |
| 1692 | 11.238 |
| 1693 | 11.233 |
| 1694 | 11.377 |
| 1695 | 11.371 |
| 1696 | 11.374 |
| 1697 | 11.443 |
| 1698 | 11.438 |
| 1699 | 11.433 |
| 1700 | 11.427 |
| 1701 | 11.423 |
| 1702 | 11.426 |
| 1703 | 11.421 |
| 1704 | 11.416 |
| 1705 | 11.41 |
| 1706 | 11.405 |
| 1707 | 11.399 |
| 1708 | 13.789 |
| 1709 | 13.782 |
| 1710 | 13.784 |
| 1711 | 13.778 |
| 1712 | 13.771 |
| 1713 | 13.768 |
| 1714 | 13.761 |
| 1715 | 13.755 |
| 1716 | 13.757 |
| 1717 | 13.753 |
| 1718 | 13.746 |
| 1719 | 13.74 |
| 1720 | 13.75 |
| 1721 | 13.743 |
| 1722 | 13.737 |
| 1723 | 13.73 |
| 1724 | 13.723 |
| 1725 | 13.717 |
| 1726 | 13.858 |
| 1727 | 13.851 |
| 1728 | 13.991 |
| 1729 | 13.987 |
| 1730 | 13.98 |
| 1731 | 13.975 |
| 1732 | 13.968 |
| 1733 | 13.969 |
| 1734 | 13.965 |
| 1735 | 13.959 |
| 1736 | 13.952 |
| 1737 | 13.945 |
| 1738 | 13.974 |
| 1739 | 13.967 |
| 1740 | 13.963 |
| 1741 | 13.958 |
| 1742 | 13.951 |
| 1743 | 13.944 |
| 1744 | 13.938 |
| 1745 | 13.931 |
| 1746 | 13.926 |
| 1747 | 13.936 |
| 1748 | 13.933 |
| 1749 | 13.927 |
| 1750 | 13.937 |
| 1751 | 13.93 |
| 1752 | 13.924 |
| 1753 | 13.917 |
| 1754 | 13.91 |
| 1755 | 13.903 |
| 1756 | 13.896 |
| 1757 | 13.89 |
| 1758 | 13.884 |
| 1759 | 13.877 |
| 1760 | 13.872 |
| 1761 | 13.865 |
| 1762 | 13.875 |
| 1763 | 13.868 |
| 1764 | 13.862 |
| 1765 | 13.855 |
| 1766 | 13.848 |
| 1767 | 13.845 |
| 1768 | 13.838 |
| 1769 | 13.832 |
| 1770 | 13.825 |
| 1771 | 13.826 |
| 1772 | 13.821 |
| 1773 | 13.815 |
| 1774 | 13.81 |
| 1775 | 13.803 |
| 1776 | 13.831 |
| 1777 | 13.825 |
| 1778 | 13.818 |
| 1779 | 13.811 |
| 1780 | 13.805 |
| 1781 | 13.798 |
| 1782 | 13.791 |
| 1783 | 13.785 |
| 1784 | 13.782 |
| 1785 | 13.775 |
| 1786 | 13.769 |
| 1787 | 13.763 |
| 1788 | 13.757 |
| 1789 | 13.751 |
| 1790 | 13.745 |
| 1791 | 13.739 |
| 1792 | 13.736 |
| 1793 | 13.729 |
| 1794 | 13.73 |
| 1795 | 13.732 |
| 1796 | 13.725 |
| 1797 | 13.719 |
| 1798 | 13.712 |
| 1799 | 13.706 |
| 1800 | 13.699 |
| 1801 | 13.7 |
| 1802 | 13.695 |
| 1803 | 13.69 |
| 1804 | 13.684 |
| 1805 | 13.678 |
| 1806 | 13.671 |
| 1807 | 13.668 |
| 1808 | 13.662 |
| 1809 | 13.655 |
| 1810 | 13.657 |
| 1811 | 13.65 |
| 1812 | 13.645 |
| 1813 | 13.638 |
| 1814 | 13.632 |
| 1815 | 13.626 |
| 1816 | 13.619 |
| 1817 | 13.613 |
| 1818 | 13.61 |
| 1819 | 13.603 |
| 1820 | 13.631 |
| 1821 | 13.632 |
| 1822 | 13.626 |
| 1823 | 13.627 |
| 1824 | 13.624 |
| 1825 | 13.618 |
| 1826 | 13.628 |
| 1827 | 13.621 |
| 1828 | 13.615 |
| 1829 | 13.612 |
| 1830 | 13.606 |
| 1831 | 13.599 |
| 1832 | 13.594 |
| 1833 | 13.591 |
| 1834 | 13.723 |
| 1835 | 13.717 |
| 1836 | 13.714 |
| 1837 | 13.711 |
| 1838 | 13.704 |
| 1839 | 13.698 |
| 1840 | 13.691 |
| 1841 | 13.685 |
| 1842 | 13.679 |
| 1843 | 13.672 |
| 1844 | 13.666 |
| 1845 | 13.66 |
| 1846 | 13.657 |
| 1847 | 13.654 |
| 1848 | 13.648 |
| 1849 | 13.645 |
| 1850 | 13.64 |
| 1851 | 13.635 |
| 1852 | 13.629 |
| 1853 | 13.622 |
| 1854 | 13.632 |
| 1855 | 13.626 |
| 1856 | 13.62 |
| 1857 | 13.614 |
| 1858 | 13.608 |
| 1859 | 13.603 |
| 1860 | 13.6 |
| 1861 | 13.662 |
| 1862 | 13.656 |
| 1863 | 13.653 |
| 1864 | 13.65 |
| 1865 | 13.647 |
| 1866 | 13.642 |
| 1867 | 13.643 |
| 1868 | 13.64 |
| 1869 | 13.634 |
| 1870 | 13.631 |
| 1871 | 13.632 |
| 1872 | 13.629 |
| 1873 | 13.624 |
| 1874 | 13.621 |
| 1875 | 13.618 |
| 1876 | 13.612 |
| 1877 | 13.609 |
| 1878 | 13.606 |
| 1879 | 13.6 |
| 1880 | 13.61 |
| 1881 | 13.604 |
| 1882 | 13.599 |
| 1883 | 13.592 |
| 1884 | 13.586 |
| 1885 | 13.58 |
| 1886 | 13.575 |
| 1887 | 13.569 |
| 1888 | 13.579 |
| 1889 | 13.58 |
| 1890 | 13.577 |
| 1891 | 13.572 |
| 1892 | 13.567 |
| 1893 | 13.564 |
| 1894 | 13.559 |
| 1895 | 13.585 |
| 1896 | 13.58 |
| 1897 | 13.574 |
| 1898 | 13.576 |
| 1899 | 13.573 |
| 1900 | 13.567 |
| 1901 | 13.562 |
| 1902 | 13.555 |
| 1903 | 13.549 |
| 1904 | 13.543 |
| 1905 | 13.537 |
| 1906 | 13.547 |
| 1907 | 13.542 |
| 1908 | 13.537 |
| 1909 | 13.531 |
| 1910 | 13.528 |
| 1911 | 13.522 |
| 1912 | 13.516 |
| 1913 | 13.51 |
| 1914 | 13.504 |
| 1915 | 13.514 |
| 1916 | 13.511 |
| 1917 | 13.506 |
| 1918 | 13.503 |
| 1919 | 13.498 |
| 1920 | 13.492 |
| 1921 | 13.489 |
| 1922 | 13.486 |
| 1923 | 13.48 |
| 1924 | 13.475 |
| 1925 | 13.469 |
| 1926 | 13.496 |
| 1927 | 13.49 |
| 1928 | 13.484 |
| 1929 | 13.478 |
| 1930 | 13.472 |
| 1931 | 13.473 |
| 1932 | 13.468 |
| 1933 | 13.462 |
| 1934 | 13.457 |
| 1935 | 13.452 |
| 1936 | 13.462 |
| 1937 | 13.456 |
| 1938 | 13.453 |
| 1939 | 13.447 |
| 1940 | 13.442 |
| 1941 | 13.436 |
| 1942 | 13.43 |
| 1943 | 13.424 |
| 1944 | 13.418 |
| 1945 | 13.412 |
| 1946 | 13.438 |
| 1947 | 13.432 |
| 1948 | 13.426 |
| 1949 | 13.421 |
| 1950 | 13.415 |
| 1951 | 13.41 |
| 1952 | 13.419 |
| 1953 | 13.415 |
| 1954 | 13.409 |
| 1955 | 13.403 |
| 1956 | 13.398 |
| 1957 | 13.395 |
| 1958 | 13.393 |
| 1959 | 13.388 |
| 1960 | 13.383 |
| 1961 | 13.377 |
| 1962 | 13.371 |
| 1963 | 13.367 |
| 1964 | 13.364 |
| 1965 | 13.359 |
| 1966 | 13.353 |
| 1967 | 13.351 |
| 1968 | 13.345 |
| 1969 | 13.339 |
| 1970 | 13.333 |
| 1971 | 13.328 |
| 1972 | 13.323 |
| 1973 | 13.317 |
| 1974 | 13.311 |
| 1975 | 13.306 |
| 1976 | 13.301 |
| 1977 | 13.302 |
| 1978 | 13.3 |
| 1979 | 13.297 |
| 1980 | 13.298 |
| 1981 | 13.293 |
| 1982 | 13.287 |
| 1983 | 13.282 |
| 1984 | 13.28 |
| 1985 | 13.274 |
| 1986 | 13.271 |
| 1987 | 13.266 |
| 1988 | 13.26 |
| 1989 | 13.254 |
| 1990 | 13.249 |
| 1991 | 13.246 |
| 1992 | 13.243 |
| 1993 | 13.239 |
| 1994 | 13.24 |
| 1995 | 13.235 |
| 1996 | 13.231 |
| 1997 | 13.226 |
| 1998 | 13.224 |
| 1999 | 13.221 |